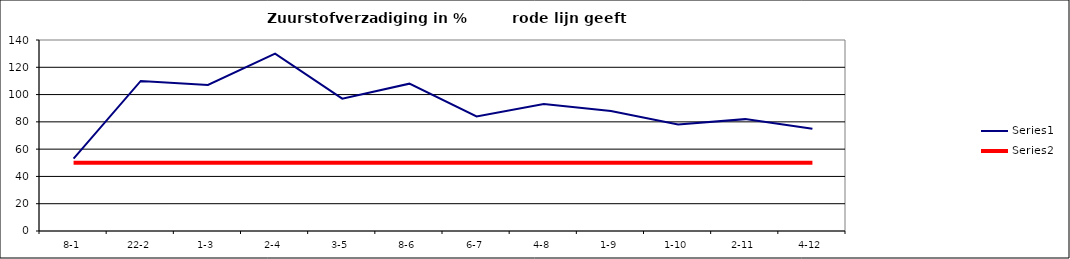
| Category | Series 0 | Series 1 |
|---|---|---|
| 8-1 | 53 | 50 |
| 22-2 | 110 | 50 |
| 1-3 | 107 | 50 |
| 2-4 | 130 | 50 |
| 3-5 | 97 | 50 |
| 8-6 | 108 | 50 |
| 6-7 | 84 | 50 |
| 4-8 | 93 | 50 |
| 1-9 | 88 | 50 |
| 1-10 | 78 | 50 |
| 2-11 | 82 | 50 |
| 4-12 | 75 | 50 |